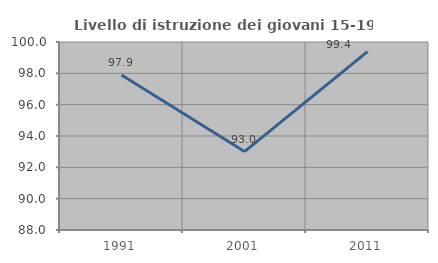
| Category | Livello di istruzione dei giovani 15-19 anni |
|---|---|
| 1991.0 | 97.887 |
| 2001.0 | 93.007 |
| 2011.0 | 99.383 |